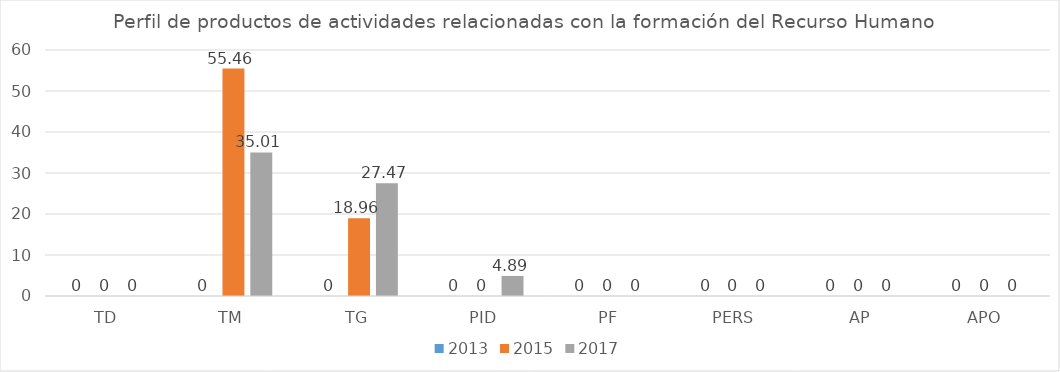
| Category | 2013 | 2015 | 2017 |
|---|---|---|---|
| TD | 0 | 0 | 0 |
| TM | 0 | 55.46 | 35.01 |
| TG | 0 | 18.96 | 27.47 |
| PID | 0 | 0 | 4.89 |
| PF | 0 | 0 | 0 |
| PERS | 0 | 0 | 0 |
| AP | 0 | 0 | 0 |
| APO | 0 | 0 | 0 |